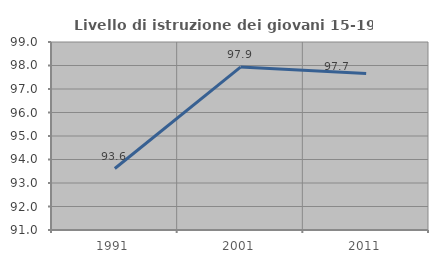
| Category | Livello di istruzione dei giovani 15-19 anni |
|---|---|
| 1991.0 | 93.617 |
| 2001.0 | 97.931 |
| 2011.0 | 97.662 |